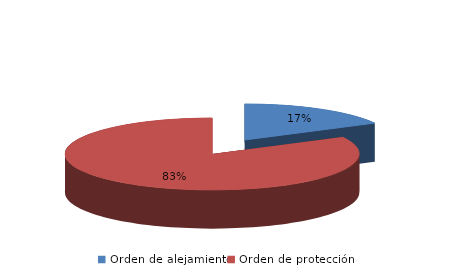
| Category | Series 0 |
|---|---|
| Orden de alejamiento | 67 |
| Orden de protección | 322 |